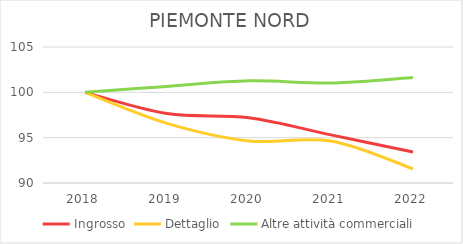
| Category | Ingrosso | Dettaglio | Altre attività commerciali |
|---|---|---|---|
| 2018.0 | 100 | 100 | 100 |
| 2019.0 | 97.66 | 96.575 | 100.652 |
| 2020.0 | 97.204 | 94.633 | 101.265 |
| 2021.0 | 95.305 | 94.633 | 101.035 |
| 2022.0 | 93.422 | 91.563 | 101.649 |